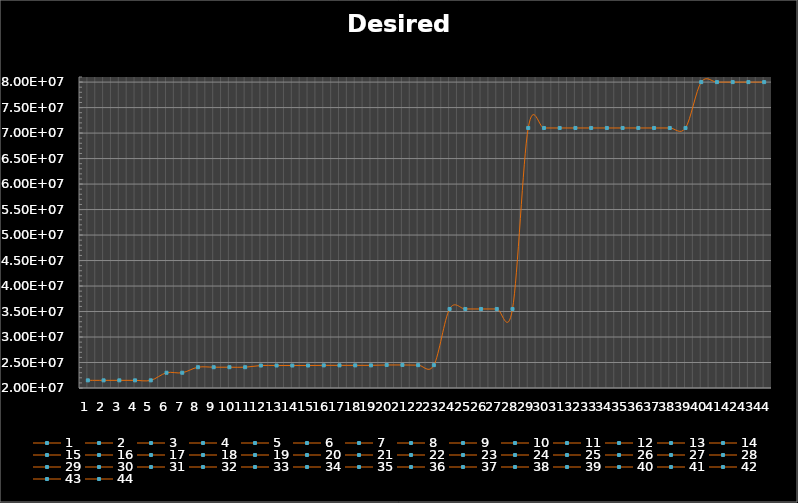
| Category | Series 0 |
|---|---|
| 0 | 21500000 |
| 1 | 21500000 |
| 2 | 21500000 |
| 3 | 21500000 |
| 4 | 21500000 |
| 5 | 22993090 |
| 6 | 22993090 |
| 7 | 24078360 |
| 8 | 24078360 |
| 9 | 24078360 |
| 10 | 24078360 |
| 11 | 24407079 |
| 12 | 24407079 |
| 13 | 24407079 |
| 14 | 24407079 |
| 15 | 24440707 |
| 16 | 24440707 |
| 17 | 24440707 |
| 18 | 24440707 |
| 19 | 24515730 |
| 20 | 24515730 |
| 21 | 24482125 |
| 22 | 24482125 |
| 23 | 35500000 |
| 24 | 35500000 |
| 25 | 35500000 |
| 26 | 35500000 |
| 27 | 35500000 |
| 28 | 71000000 |
| 29 | 71000000 |
| 30 | 71000000 |
| 31 | 71000000 |
| 32 | 71000000 |
| 33 | 71000000 |
| 34 | 71000000 |
| 35 | 71000000 |
| 36 | 71000000 |
| 37 | 71000000 |
| 38 | 71000000 |
| 39 | 80000000 |
| 40 | 80000000 |
| 41 | 80000000 |
| 42 | 80000000 |
| 43 | 80000000 |